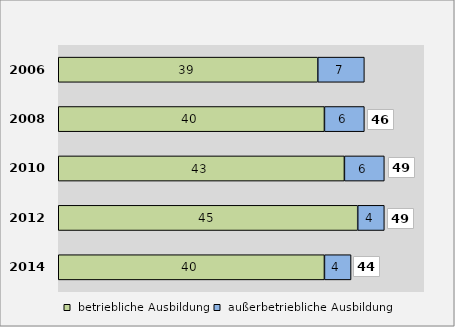
| Category |  betriebliche Ausbildung |  außerbetriebliche Ausbildung |
|---|---|---|
| 2014.0 | 40 | 4 |
| 2012.0 | 45 | 4 |
| 2010.0 | 43 | 6 |
| 2008.0 | 40 | 6 |
| 2006.0 | 39 | 7 |